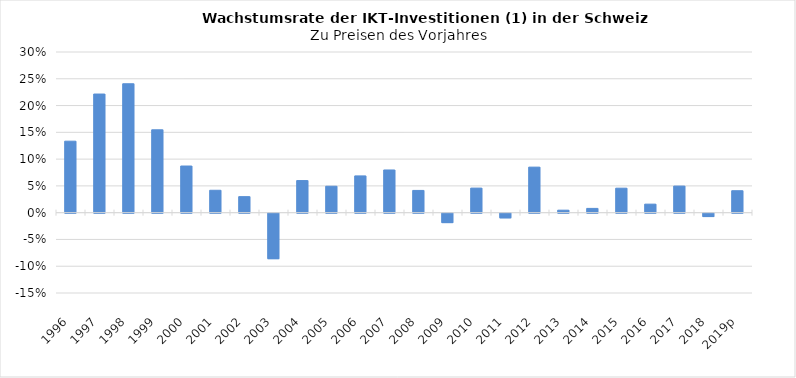
| Category | Total IKT (ohne Messinstrumente) |
|---|---|
| 1996 | 0.133 |
| 1997 | 0.222 |
| 1998 | 0.241 |
| 1999 | 0.155 |
| 2000 | 0.087 |
| 2001 | 0.042 |
| 2002 | 0.03 |
| 2003 | -0.085 |
| 2004 | 0.06 |
| 2005 | 0.049 |
| 2006 | 0.069 |
| 2007 | 0.08 |
| 2008 | 0.042 |
| 2009 | -0.018 |
| 2010 | 0.046 |
| 2011 | -0.009 |
| 2012 | 0.085 |
| 2013 | 0.005 |
| 2014 | 0.008 |
| 2015 | 0.046 |
| 2016 | 0.016 |
| 2017 | 0.05 |
| 2018 | -0.006 |
| 2019p | 0.041 |